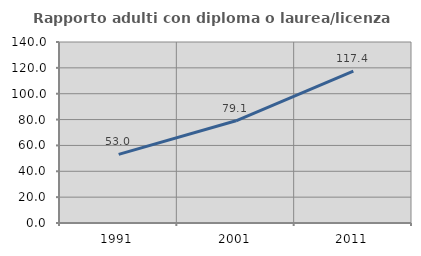
| Category | Rapporto adulti con diploma o laurea/licenza media  |
|---|---|
| 1991.0 | 53.042 |
| 2001.0 | 79.05 |
| 2011.0 | 117.384 |